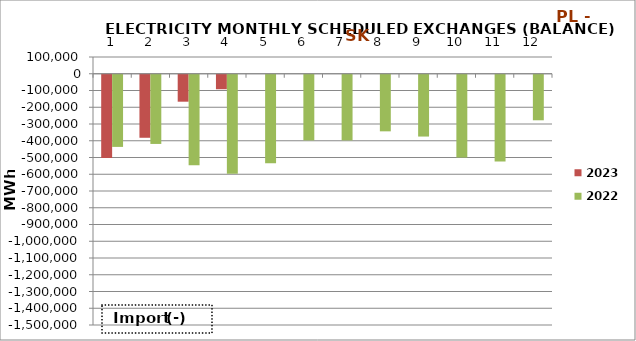
| Category | 2023 | 2022 |
|---|---|---|
| 0 | -497249.3 | -430778.6 |
| 1 | -376275.2 | -413059.5 |
| 2 | -160843.3 | -539610.2 |
| 3 | -86467.3 | -590685.6 |
| 4 | 0 | -528985.9 |
| 5 | 0 | -392038.6 |
| 6 | 0 | -391971.9 |
| 7 | 0 | -337824.7 |
| 8 | 0 | -368982.2 |
| 9 | 0 | -494048.4 |
| 10 | 0 | -518526.5 |
| 11 | 0 | -271838.5 |